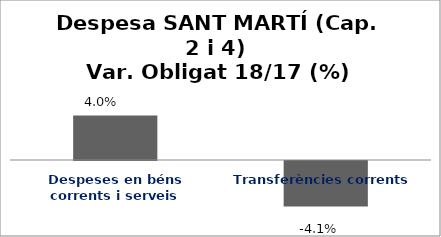
| Category | Series 0 |
|---|---|
| Despeses en béns corrents i serveis | 0.04 |
| Transferències corrents | -0.041 |